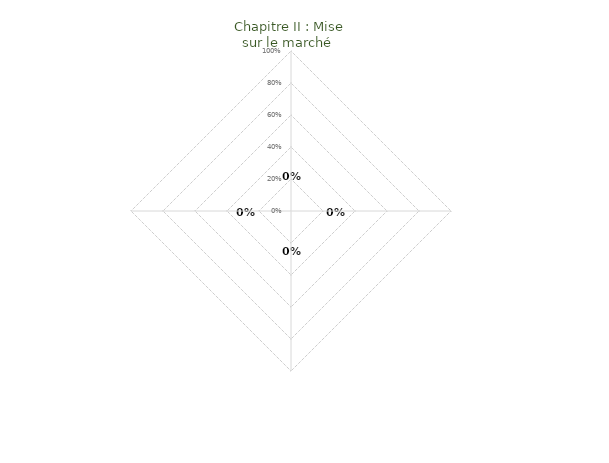
| Category | Chapitres |
|---|---|
| Chapitre II : Mise sur le marché  | 0 |
|  Chapitre III : Enregistrement, EUDAMED et Résumé périodique de sécurité et de performance | 0 |
| Chapitre VI: Evaluation clinique et investigation clinique | 0 |
| Chapitre VII: Surveillance après commercialisation, Vigilance et surveillance du marché | 0 |